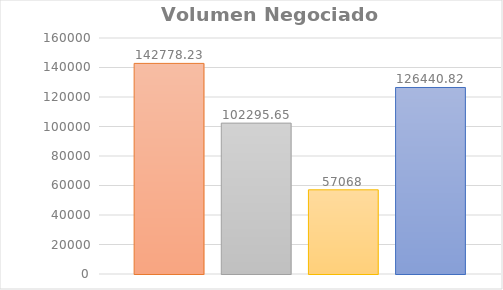
| Category | Lunes | Martes | Miercoles | Jueves | Viernes |
|---|---|---|---|---|---|
| 0 |  | 142778.23 | 102295.65 | 57068 | 126440.82 |